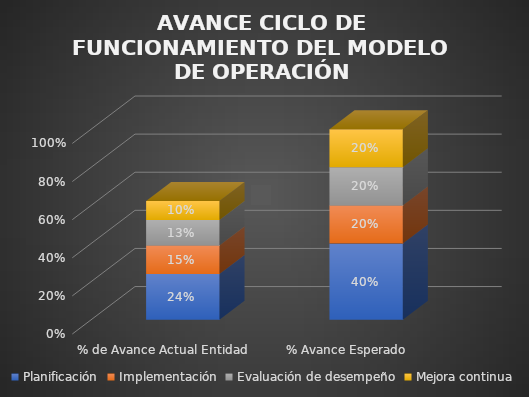
| Category | Planificación | Implementación | Evaluación de desempeño | Mejora continua |
|---|---|---|---|---|
| % de Avance Actual Entidad | 0.24 | 0.15 | 0.133 | 0.1 |
| % Avance Esperado | 0.4 | 0.2 | 0.2 | 0.2 |